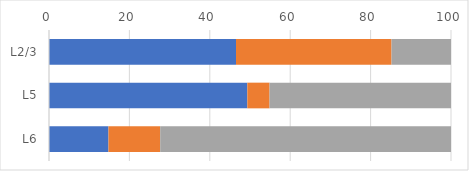
| Category | Series 0 | Series 1 | Series 2 |
|---|---|---|---|
| L2/3 | 46.519 | 38.69 | 14.791 |
| L5 | 49.337 | 5.526 | 45.137 |
| L6 | 14.792 | 12.87 | 72.338 |